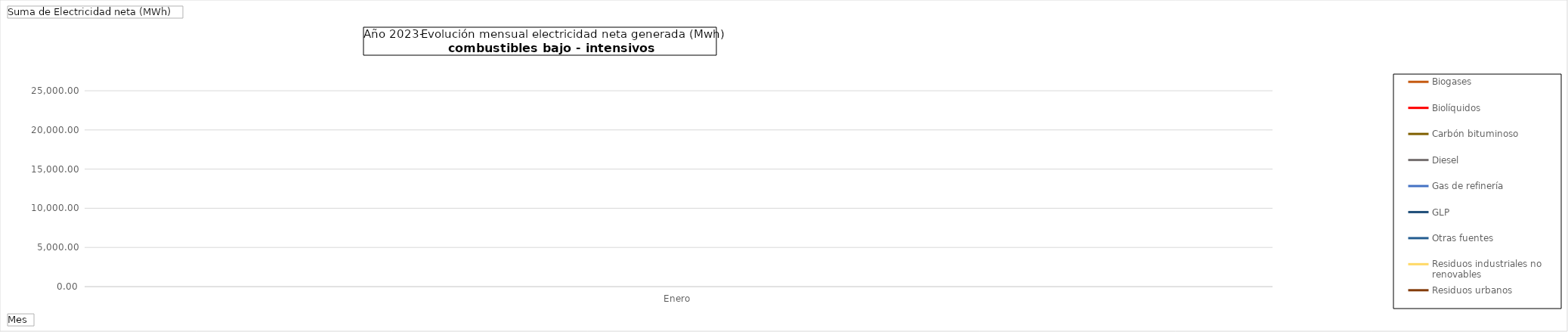
| Category | Biogases | Biolíquidos | Carbón bituminoso | Diesel | Gas de refinería | GLP | Otras fuentes | Residuos industriales no renovables | Residuos urbanos |
|---|---|---|---|---|---|---|---|---|---|
| Enero | 14049.43 | 230.76 | 15137.44 | 2474.03 | 10438.48 | 23760.02 | 5059.21 | 0 | 13611.59 |